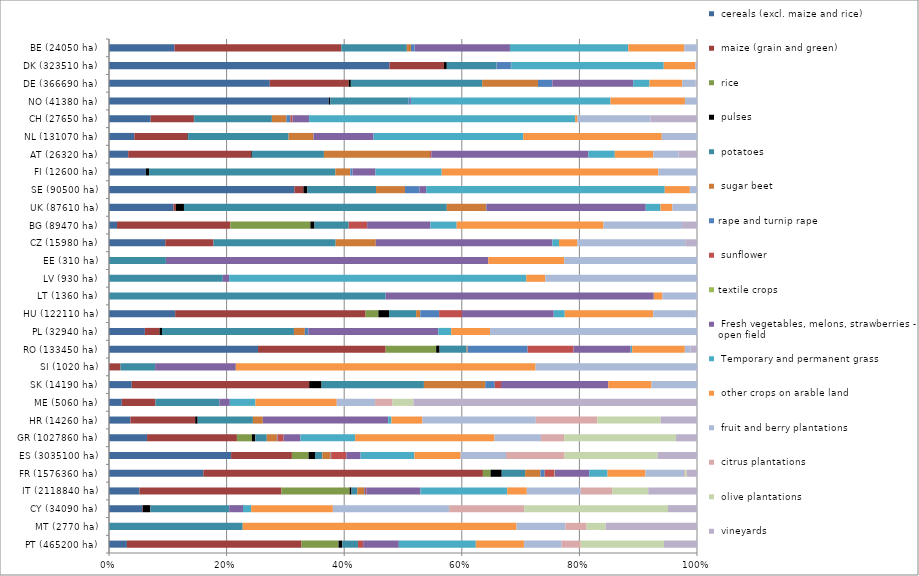
| Category |  cereals (excl. maize and rice) |  maize (grain and green) |  rice |  pulses |  potatoes |  sugar beet | rape and turnip rape |  sunflower | textile crops |  Fresh vegetables, melons, strawberries - open field |  Temporary and permanent grass  |  other crops on arable land |  fruit and berry plantations |  citrus plantations |  olive plantations |  vineyards |
|---|---|---|---|---|---|---|---|---|---|---|---|---|---|---|---|---|
| BE (24050 ha) | 0.111 | 0.284 | 0 | 0 | 0.111 | 0.007 | 0.006 | 0 | 0 | 0.162 | 0.201 | 0.095 | 0.022 | 0 | 0 | 0 |
| DK (323510 ha) | 0.477 | 0.092 | 0 | 0.005 | 0.085 | 0 | 0.024 | 0 | 0 | 0 | 0.259 | 0.054 | 0.003 | 0 | 0 | 0 |
| DE (366690 ha) | 0.273 | 0.134 | 0 | 0.004 | 0.223 | 0.095 | 0.024 | 0 | 0 | 0.137 | 0.028 | 0.056 | 0.023 | 0 | 0 | 0.002 |
| NO (41380 ha) | 0.374 | 0 | 0 | 0.002 | 0.133 | 0 | 0.003 | 0 | 0 | 0.001 | 0.339 | 0.127 | 0.021 | 0 | 0 | 0 |
| CH (27650 ha) | 0.071 | 0.073 | 0 | 0.001 | 0.132 | 0.025 | 0.007 | 0.004 | 0 | 0.028 | 0.452 | 0.004 | 0.124 | 0 | 0 | 0.079 |
| NL (131070 ha) | 0.043 | 0.091 | 0 | 0.001 | 0.171 | 0.042 | 0 | 0 | 0 | 0.102 | 0.255 | 0.236 | 0.06 | 0 | 0 | 0 |
| AT (26320 ha) | 0.033 | 0.209 | 0 | 0.001 | 0.122 | 0.18 | 0 | 0.002 | 0 | 0.267 | 0.045 | 0.065 | 0.043 | 0 | 0 | 0.032 |
| FI (12600 ha) | 0.063 | 0 | 0 | 0.006 | 0.317 | 0.025 | 0.004 | 0 | 0 | 0.039 | 0.113 | 0.368 | 0.066 | 0 | 0 | 0 |
| SE (90500 ha) | 0.315 | 0.015 | 0 | 0.007 | 0.117 | 0.049 | 0.025 | 0 | 0 | 0.012 | 0.406 | 0.043 | 0.012 | 0 | 0 | 0 |
| UK (87610 ha) | 0.11 | 0.004 | 0 | 0.014 | 0.447 | 0.067 | 0.001 | 0 | 0 | 0.271 | 0.025 | 0.02 | 0.042 | 0 | 0 | 0 |
| BG (89470 ha) | 0.014 | 0.193 | 0.136 | 0.007 | 0.058 | 0 | 0 | 0.031 | 0 | 0.108 | 0.045 | 0.25 | 0.133 | 0 | 0 | 0.026 |
| CZ (15980 ha) | 0.096 | 0.082 | 0 | 0 | 0.208 | 0.068 | 0 | 0 | 0 | 0.3 | 0.011 | 0.031 | 0.183 | 0 | 0 | 0.02 |
| EE (310 ha) | 0 | 0 | 0 | 0 | 0.097 | 0 | 0 | 0 | 0 | 0.548 | 0 | 0.129 | 0.226 | 0 | 0 | 0 |
| LV (930 ha) | 0 | 0 | 0 | 0 | 0.194 | 0 | 0 | 0 | 0 | 0.011 | 0.505 | 0.032 | 0.258 | 0 | 0 | 0 |
| LT (1360 ha) | 0 | 0 | 0 | 0 | 0.471 | 0 | 0 | 0 | 0 | 0.456 | 0 | 0.015 | 0.059 | 0 | 0 | 0 |
| HU (122110 ha) | 0.113 | 0.324 | 0.022 | 0.018 | 0.046 | 0.007 | 0.032 | 0.039 | 0 | 0.156 | 0.019 | 0.151 | 0.073 | 0 | 0 | 0.002 |
| PL (32940 ha) | 0.061 | 0.025 | 0 | 0.004 | 0.224 | 0.019 | 0.006 | 0 | 0 | 0.221 | 0.022 | 0.066 | 0.352 | 0 | 0 | 0 |
| RO (133450 ha) | 0.253 | 0.217 | 0.086 | 0.006 | 0.046 | 0.002 | 0.102 | 0.078 | 0 | 0.097 | 0.002 | 0.09 | 0.009 | 0 | 0 | 0.011 |
| SI (1020 ha) | 0 | 0.02 | 0 | 0 | 0.059 | 0 | 0 | 0 | 0 | 0.137 | 0 | 0.51 | 0.275 | 0 | 0 | 0 |
| SK (14190 ha) | 0.039 | 0.302 | 0 | 0.021 | 0.174 | 0.104 | 0.016 | 0.011 | 0 | 0.183 | 0 | 0.073 | 0.078 | 0 | 0 | 0 |
| ME (5060 ha) | 0.022 | 0.057 | 0 | 0 | 0.109 | 0 | 0 | 0 | 0 | 0.018 | 0.043 | 0.138 | 0.065 | 0.03 | 0.036 | 0.482 |
| HR (14260 ha) | 0.036 | 0.11 | 0 | 0.004 | 0.094 | 0.017 | 0 | 0 | 0 | 0.213 | 0.006 | 0.053 | 0.193 | 0.104 | 0.108 | 0.062 |
| GR (1027860 ha) | 0.065 | 0.153 | 0.026 | 0.006 | 0.02 | 0.017 | 0.001 | 0.01 | 0 | 0.029 | 0.093 | 0.237 | 0.079 | 0.04 | 0.19 | 0.036 |
| ES (3035100 ha) | 0.208 | 0.103 | 0.028 | 0.011 | 0.013 | 0.014 | 0.001 | 0.026 | 0 | 0.024 | 0.092 | 0.079 | 0.077 | 0.1 | 0.158 | 0.067 |
| FR (1576360 ha) | 0.16 | 0.475 | 0.013 | 0.019 | 0.04 | 0.026 | 0.007 | 0.017 | 0.001 | 0.058 | 0.031 | 0.064 | 0.066 | 0.001 | 0.003 | 0.017 |
| IT (2118840 ha) | 0.052 | 0.241 | 0.116 | 0.003 | 0.01 | 0.012 | 0.001 | 0.002 | 0 | 0.092 | 0.148 | 0.033 | 0.092 | 0.053 | 0.061 | 0.083 |
| CY (34090 ha) | 0.056 | 0.001 | 0 | 0.013 | 0.134 | 0 | 0 | 0 | 0 | 0.023 | 0.014 | 0.139 | 0.198 | 0.128 | 0.245 | 0.049 |
| MT (2770 ha) | 0 | 0 | 0 | 0 | 0.227 | 0 | 0 | 0 | 0 | 0 | 0 | 0.466 | 0.083 | 0.036 | 0.032 | 0.155 |
| PT (465200 ha) | 0.031 | 0.297 | 0.063 | 0.007 | 0.027 | 0 | 0 | 0.009 | 0 | 0.061 | 0.131 | 0.082 | 0.064 | 0.033 | 0.142 | 0.056 |